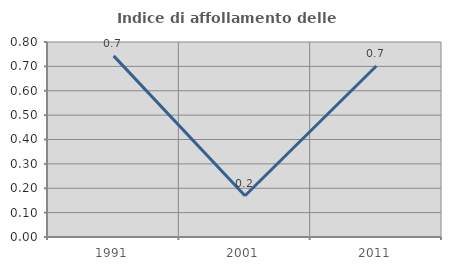
| Category | Indice di affollamento delle abitazioni  |
|---|---|
| 1991.0 | 0.743 |
| 2001.0 | 0.169 |
| 2011.0 | 0.702 |